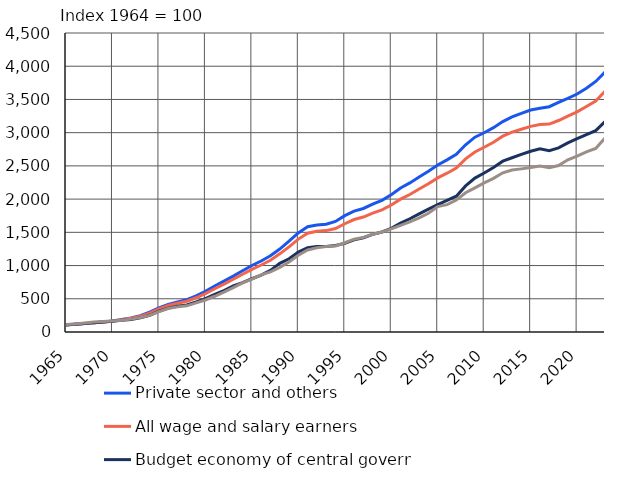
| Category | Private sector and others | All wage and salary earners | Budget economy of central government | Local government |
|---|---|---|---|---|
| 1965 | 108 | 108.6 | 107 | 112 |
| 1966 | 116 | 116.5 | 115 | 122 |
| 1967 | 126 | 126.8 | 126 | 134 |
| 1968 | 139 | 140.8 | 141 | 149 |
| 1969 | 150 | 151.2 | 151 | 158 |
| 1970 | 164 | 163.9 | 161 | 165 |
| 1971 | 188 | 184.8 | 176 | 178 |
| 1972 | 212 | 206.3 | 189 | 194 |
| 1973 | 247 | 238 | 213 | 217 |
| 1974 | 298 | 284.8 | 252 | 250 |
| 1975 | 362 | 347.2 | 312 | 307 |
| 1976 | 416 | 399.1 | 360 | 353 |
| 1977 | 453 | 432.9 | 387 | 378 |
| 1978 | 487 | 462.4 | 408 | 394 |
| 1979 | 544 | 515.3 | 452 | 439 |
| 1980 | 612 | 577.3 | 502 | 482 |
| 1981 | 692 | 651 | 565 | 538 |
| 1982 | 765 | 719.9 | 624 | 600 |
| 1983 | 840.9 | 794.5 | 692.8 | 667.7 |
| 1984 | 921.8 | 869.5 | 742.3 | 738.3 |
| 1985 | 1001.4 | 942.7 | 801.3 | 795.1 |
| 1986 | 1068.8 | 1008.4 | 855.3 | 859.6 |
| 1987 | 1146.6 | 1079.3 | 928 | 904.4 |
| 1988 | 1248.2 | 1176.2 | 1033 | 972.2 |
| 1989 | 1366.4 | 1280.6 | 1102.1 | 1052.9 |
| 1990 | 1490.8 | 1398.2 | 1201.5 | 1154 |
| 1991 | 1585.1 | 1487 | 1267.1 | 1234.2 |
| 1992 | 1611.4 | 1515.2 | 1288.3 | 1269.1 |
| 1993 | 1621.8 | 1526.2 | 1287.8 | 1285.8 |
| 1994 | 1663.5 | 1556.7 | 1302.4 | 1294.8 |
| 1995 | 1751.7 | 1629.4 | 1334.2 | 1343 |
| 1996 | 1819 | 1693 | 1386 | 1397 |
| 1997 | 1859 | 1730 | 1419 | 1424 |
| 1998 | 1925 | 1789 | 1469 | 1471 |
| 1999 | 1981 | 1839 | 1505 | 1506 |
| 2000 | 2067 | 1912 | 1560 | 1551 |
| 2001 | 2167 | 1999 | 1639 | 1606 |
| 2002 | 2244 | 2069 | 1704 | 1657 |
| 2003 | 2333 | 2151 | 1777 | 1718 |
| 2004 | 2419 | 2232 | 1848 | 1786 |
| 2005 | 2513 | 2319 | 1916 | 1888 |
| 2006 | 2590 | 2390 | 1981 | 1917 |
| 2007 | 2673 | 2469 | 2044 | 1986 |
| 2008 | 2818 | 2606 | 2198 | 2096 |
| 2009 | 2932 | 2710 | 2316 | 2170 |
| 2010 | 2999 | 2781 | 2393 | 2245 |
| 2011 | 3075 | 2856 | 2476 | 2312 |
| 2012 | 3167 | 2947 | 2571 | 2396 |
| 2013 | 3237 | 3009 | 2622 | 2438 |
| 2014 | 3290 | 3052 | 2672 | 2455 |
| 2015 | 3341 | 3095 | 2720 | 2475 |
| 2016 | 3367 | 3123 | 2757 | 2498 |
| 2017 | 3391 | 3130 | 2730 | 2472 |
| 2018 | 3455 | 3183 | 2771 | 2505 |
| 2019 | 3515.589 | 3250 | 2845.381 | 2591.118 |
| 2020 | 3582 | 3313 | 2909 | 2647 |
| 2021 | 3669 | 3393 | 2971 | 2710 |
| 2022 | 3770.941 | 3475 | 3030.565 | 2763.485 |
| 2023* | 3911.9 | 3622 | 3166.6 | 2918.5 |